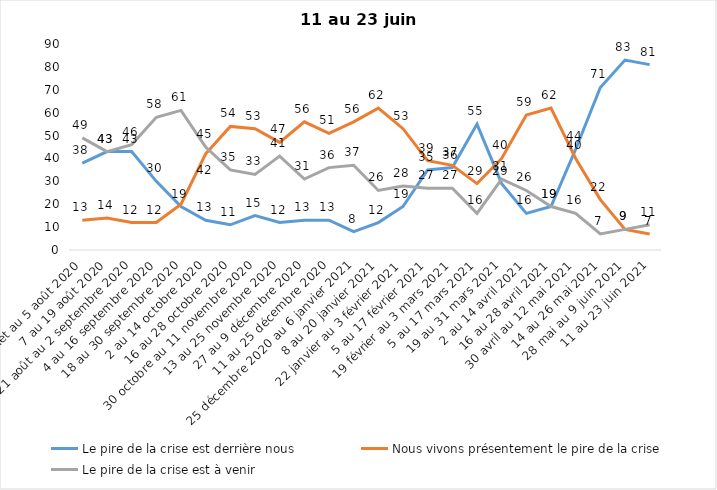
| Category | Le pire de la crise est derrière nous | Nous vivons présentement le pire de la crise | Le pire de la crise est à venir |
|---|---|---|---|
| 24 juillet au 5 août 2020 | 38 | 13 | 49 |
| 7 au 19 août 2020 | 43 | 14 | 43 |
| 21 août au 2 septembre 2020 | 43 | 12 | 46 |
| 4 au 16 septembre 2020 | 30 | 12 | 58 |
| 18 au 30 septembre 2020 | 19 | 20 | 61 |
| 2 au 14 octobre 2020 | 13 | 42 | 45 |
| 16 au 28 octobre 2020 | 11 | 54 | 35 |
| 30 octobre au 11 novembre 2020 | 15 | 53 | 33 |
| 13 au 25 novembre 2020 | 12 | 47 | 41 |
| 27 au 9 décembre 2020 | 13 | 56 | 31 |
| 11 au 25 décembre 2020 | 13 | 51 | 36 |
| 25 décembre 2020 au 6 janvier 2021 | 8 | 56 | 37 |
| 8 au 20 janvier 2021 | 12 | 62 | 26 |
| 22 janvier au 3 février 2021 | 19 | 53 | 28 |
| 5 au 17 février 2021 | 35 | 39 | 27 |
| 19 février au 3 mars 2021 | 36 | 37 | 27 |
| 5 au 17 mars 2021 | 55 | 29 | 16 |
| 19 au 31 mars 2021 | 29 | 40 | 31 |
| 2 au 14 avril 2021 | 16 | 59 | 26 |
| 16 au 28 avril 2021 | 19 | 62 | 19 |
| 30 avril au 12 mai 2021 | 44 | 40 | 16 |
| 14 au 26 mai 2021 | 71 | 22 | 7 |
| 28 mai au 9 juin 2021 | 83 | 9 | 9 |
| 11 au 23 juin 2021 | 81 | 7 | 11 |